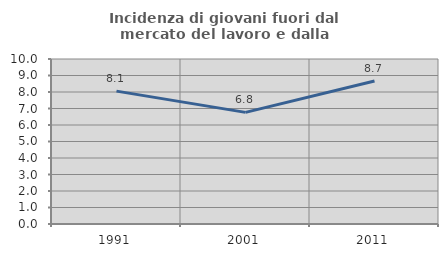
| Category | Incidenza di giovani fuori dal mercato del lavoro e dalla formazione  |
|---|---|
| 1991.0 | 8.052 |
| 2001.0 | 6.765 |
| 2011.0 | 8.663 |